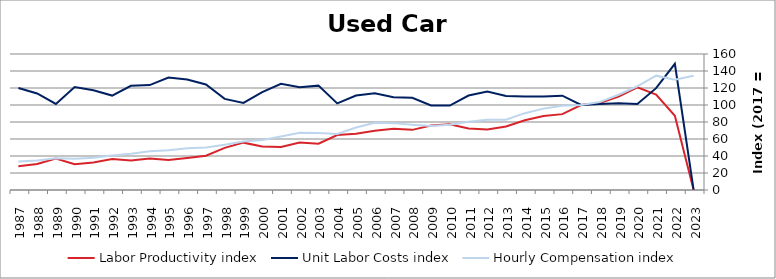
| Category | Labor Productivity index | Unit Labor Costs index | Hourly Compensation index |
|---|---|---|---|
| 2023.0 | 0 | 0 | 134.393 |
| 2022.0 | 87.385 | 148.418 | 129.695 |
| 2021.0 | 112.249 | 119.818 | 134.495 |
| 2020.0 | 120.729 | 101.074 | 122.026 |
| 2019.0 | 109.804 | 102.028 | 112.03 |
| 2018.0 | 102.329 | 101.173 | 103.529 |
| 2017.0 | 100 | 100 | 100 |
| 2016.0 | 89.254 | 110.934 | 99.013 |
| 2015.0 | 86.94 | 110.133 | 95.75 |
| 2014.0 | 82.134 | 110.054 | 90.391 |
| 2013.0 | 74.754 | 110.491 | 82.597 |
| 2012.0 | 71.268 | 115.833 | 82.551 |
| 2011.0 | 72.347 | 111.157 | 80.419 |
| 2010.0 | 77.213 | 99.311 | 76.681 |
| 2009.0 | 75.751 | 99.499 | 75.372 |
| 2008.0 | 70.746 | 108.544 | 76.791 |
| 2007.0 | 72.139 | 109.058 | 78.673 |
| 2006.0 | 69.58 | 113.841 | 79.211 |
| 2005.0 | 66.089 | 111.115 | 73.435 |
| 2004.0 | 64.742 | 101.851 | 65.94 |
| 2003.0 | 54.519 | 122.789 | 66.944 |
| 2002.0 | 55.852 | 120.808 | 67.474 |
| 2001.0 | 50.491 | 124.863 | 63.044 |
| 2000.0 | 51.171 | 115.091 | 58.894 |
| 1999.0 | 55.705 | 102.424 | 57.055 |
| 1998.0 | 49.586 | 107.184 | 53.148 |
| 1997.0 | 40.259 | 124.096 | 49.96 |
| 1996.0 | 37.764 | 129.875 | 49.046 |
| 1995.0 | 35.424 | 132.223 | 46.838 |
| 1994.0 | 36.952 | 123.428 | 45.609 |
| 1993.0 | 34.762 | 122.641 | 42.632 |
| 1992.0 | 36.451 | 111.109 | 40.5 |
| 1991.0 | 32.381 | 117.436 | 38.027 |
| 1990.0 | 30.376 | 121.176 | 36.809 |
| 1989.0 | 37.01 | 101.246 | 37.471 |
| 1988.0 | 30.666 | 113.553 | 34.822 |
| 1987.0 | 27.881 | 120.083 | 33.481 |